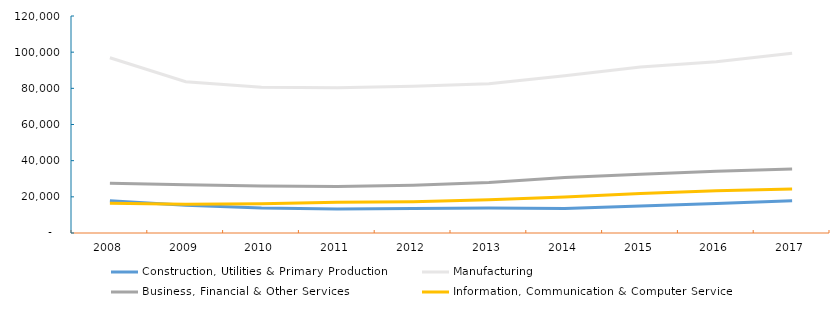
| Category | Construction, Utilities & Primary Production  | Manufacturing  | Business, Financial & Other Services | Information, Communication & Computer Services |
|---|---|---|---|---|
| 2008.0 | 17840 | 96896 | 27519 | 16497 |
| 2009.0 | 15353 | 83659 | 26661 | 15950 |
| 2010.0 | 13815 | 80561 | 26038 | 16203 |
| 2011.0 | 13289 | 80323 | 25686 | 17041 |
| 2012.0 | 13594 | 81203 | 26368 | 17266 |
| 2013.0 | 13847 | 82545 | 27965 | 18384 |
| 2014.0 | 13573 | 87009 | 30653 | 19921 |
| 2015.0 | 14947 | 91750 | 32549 | 21842 |
| 2016.0 | 16372 | 94692 | 34103 | 23310 |
| 2017.0 | 17890 | 99419 | 35446 | 24352 |